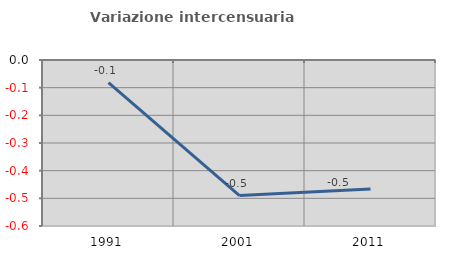
| Category | Variazione intercensuaria annua |
|---|---|
| 1991.0 | -0.082 |
| 2001.0 | -0.49 |
| 2011.0 | -0.467 |